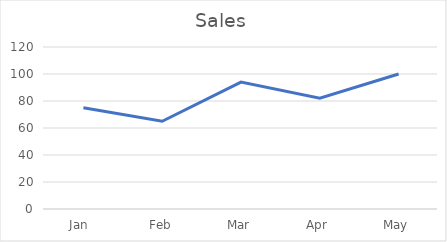
| Category | Sales |
|---|---|
| Jan  | 75 |
| Feb | 65 |
| Mar | 94 |
| Apr | 82 |
| May | 100 |